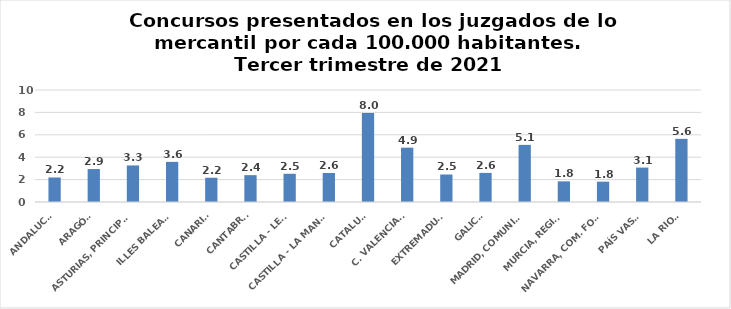
| Category | Series 0 |
|---|---|
| ANDALUCÍA | 2.189 |
| ARAGÓN | 2.943 |
| ASTURIAS, PRINCIPADO | 3.262 |
| ILLES BALEARS | 3.583 |
| CANARIAS | 2.165 |
| CANTABRIA | 2.396 |
| CASTILLA - LEÓN | 2.52 |
| CASTILLA - LA MANCHA | 2.588 |
| CATALUÑA | 7.954 |
| C. VALENCIANA | 4.852 |
| EXTREMADURA | 2.456 |
| GALICIA | 2.598 |
| MADRID, COMUNIDAD | 5.1 |
| MURCIA, REGIÓN | 1.845 |
| NAVARRA, COM. FORAL | 1.815 |
| PAÍS VASCO | 3.073 |
| LA RIOJA | 5.639 |